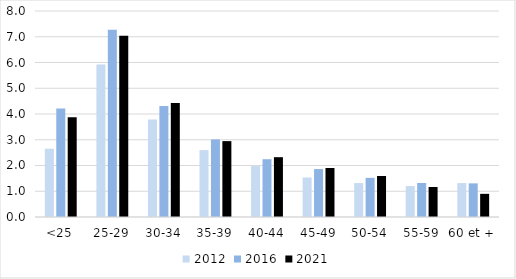
| Category | 2012 | 2016 | 2021 |
|---|---|---|---|
| <25 | 2.649 | 4.211 | 3.877 |
| 25-29 | 5.918 | 7.269 | 7.034 |
| 30-34 | 3.787 | 4.311 | 4.431 |
| 35-39 | 2.598 | 3.011 | 2.947 |
| 40-44 | 1.977 | 2.245 | 2.322 |
| 45-49 | 1.532 | 1.862 | 1.903 |
| 50-54 | 1.319 | 1.52 | 1.593 |
| 55-59 | 1.2 | 1.321 | 1.164 |
| 60 et + | 1.318 | 1.306 | 0.899 |